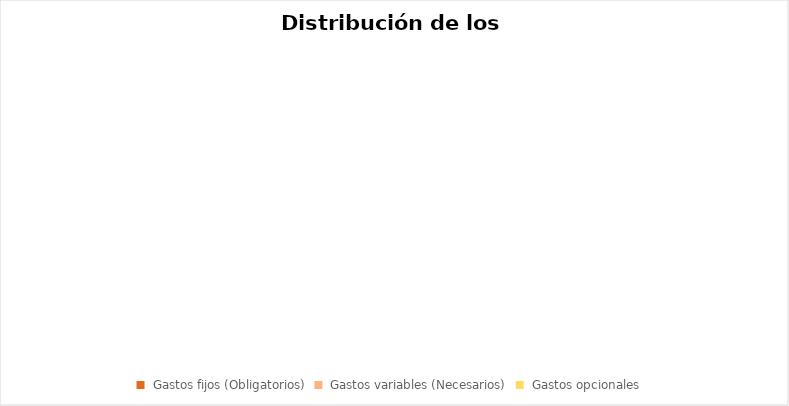
| Category | Series 0 |
|---|---|
|  Gastos fijos (Obligatorios)  | 0 |
|  Gastos variables (Necesarios)  | 0 |
|  Gastos opcionales  | 0 |